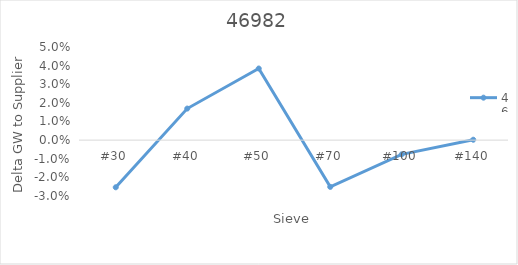
| Category | 46982 |
|---|---|
| #30 | -0.025 |
| #40 | 0.017 |
| #50 | 0.038 |
| #70 | -0.025 |
| #100 | -0.008 |
| #140 | 0 |